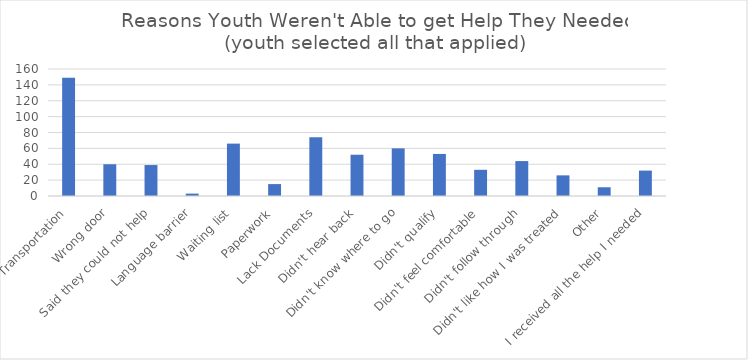
| Category | Series 0 |
|---|---|
| Transportation | 149 |
| Wrong door | 40 |
| Said they could not help | 39 |
| Language barrier | 3 |
| Waiting list | 66 |
| Paperwork | 15 |
| Lack Documents | 74 |
| Didn't hear back | 52 |
| Didn't know where to go | 60 |
| Didn't qualify | 53 |
| Didn't feel comfortable | 33 |
| Didn't follow through | 44 |
| Didn't like how I was treated | 26 |
| Other | 11 |
| I received all the help I needed | 32 |